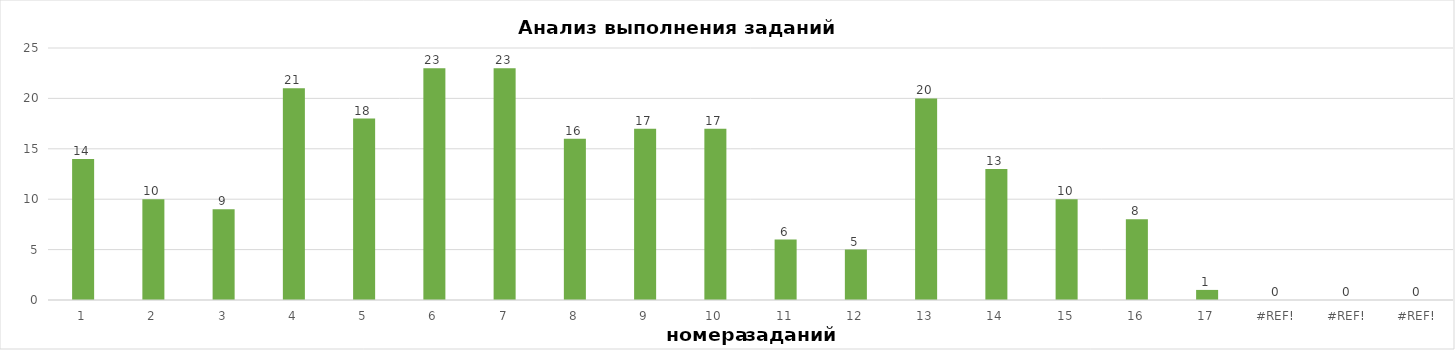
| Category | задания |
|---|---|
| 1.0 | 14 |
| 2.0 | 10 |
| 3.0 | 9 |
| 4.0 | 21 |
| 5.0 | 18 |
| 6.0 | 23 |
| 7.0 | 23 |
| 8.0 | 16 |
| 9.0 | 17 |
| 10.0 | 17 |
| 11.0 | 6 |
| 12.0 | 5 |
| 13.0 | 20 |
| 14.0 | 13 |
| 15.0 | 10 |
| 16.0 | 8 |
| 17.0 | 1 |
| 0.0 | 0 |
| 0.0 | 0 |
| 0.0 | 0 |